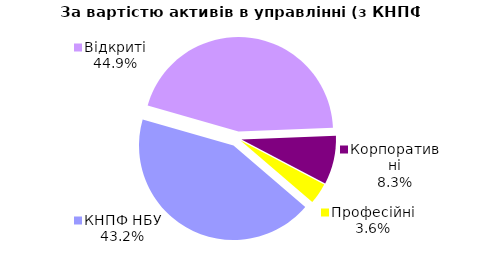
| Category | Series 0 |
|---|---|
| Відкриті | 2092.682 |
| Корпоративні | 387.713 |
| Професійні | 167.23 |
| КНПФ НБУ | 2010.921 |